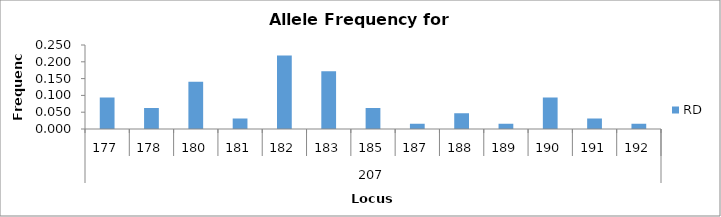
| Category | RD |
|---|---|
| 0 | 0.094 |
| 1 | 0.062 |
| 2 | 0.141 |
| 3 | 0.031 |
| 4 | 0.219 |
| 5 | 0.172 |
| 6 | 0.062 |
| 7 | 0.016 |
| 8 | 0.047 |
| 9 | 0.016 |
| 10 | 0.094 |
| 11 | 0.031 |
| 12 | 0.016 |